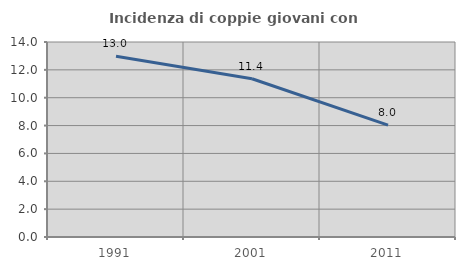
| Category | Incidenza di coppie giovani con figli |
|---|---|
| 1991.0 | 12.981 |
| 2001.0 | 11.364 |
| 2011.0 | 8.029 |